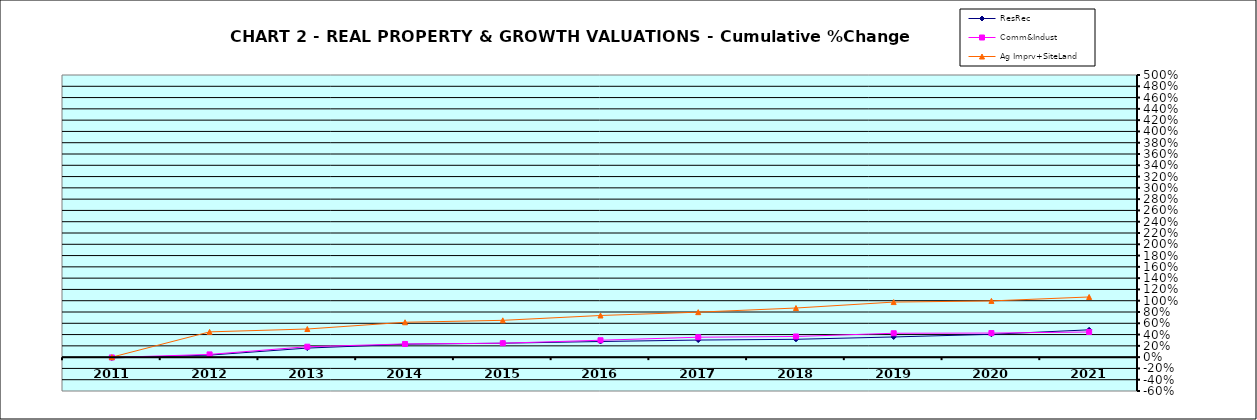
| Category | ResRec | Comm&Indust | Ag Imprv+SiteLand |
|---|---|---|---|
| 2011.0 | -0.013 | -0.005 | 0 |
| 2012.0 | 0.036 | 0.048 | 0.448 |
| 2013.0 | 0.16 | 0.185 | 0.499 |
| 2014.0 | 0.229 | 0.234 | 0.618 |
| 2015.0 | 0.247 | 0.247 | 0.652 |
| 2016.0 | 0.277 | 0.299 | 0.738 |
| 2017.0 | 0.303 | 0.353 | 0.797 |
| 2018.0 | 0.316 | 0.366 | 0.871 |
| 2019.0 | 0.358 | 0.423 | 0.976 |
| 2020.0 | 0.405 | 0.427 | 0.997 |
| 2021.0 | 0.484 | 0.446 | 1.066 |